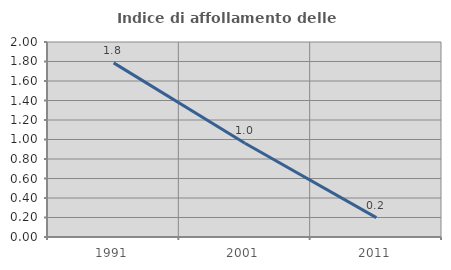
| Category | Indice di affollamento delle abitazioni  |
|---|---|
| 1991.0 | 1.786 |
| 2001.0 | 0.962 |
| 2011.0 | 0.199 |